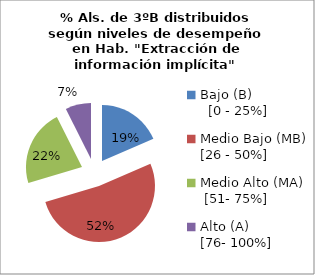
| Category | Series 0 |
|---|---|
| Bajo (B)                 [0 - 25%] | 5 |
| Medio Bajo (MB)  [26 - 50%] | 14 |
| Medio Alto (MA)   [51- 75%] | 6 |
| Alto (A)               [76- 100%] | 2 |